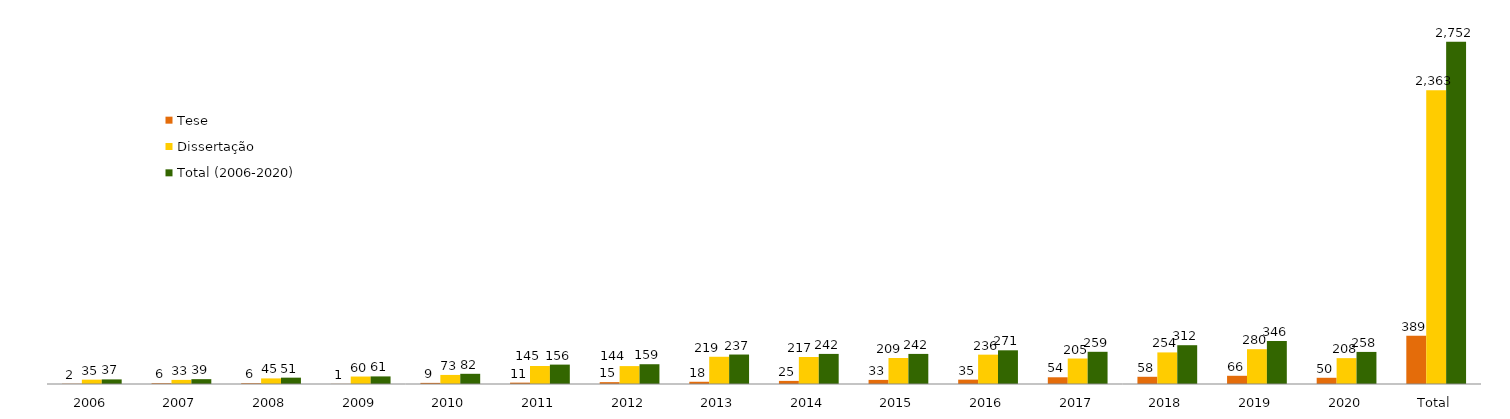
| Category | Tese | Dissertação | Total (2006-2020) |
|---|---|---|---|
| 2006 | 2 | 35 | 37 |
| 2007 | 6 | 33 | 39 |
| 2008 | 6 | 45 | 51 |
| 2009 | 1 | 60 | 61 |
| 2010 | 9 | 73 | 82 |
| 2011 | 11 | 145 | 156 |
| 2012 | 15 | 144 | 159 |
| 2013 | 18 | 219 | 237 |
| 2014 | 25 | 217 | 242 |
| 2015 | 33 | 209 | 242 |
| 2016 | 35 | 236 | 271 |
| 2017 | 54 | 205 | 259 |
| 2018 | 58 | 254 | 312 |
| 2019 | 66 | 280 | 346 |
| 2020 | 50 | 208 | 258 |
| Total | 389 | 2363 | 2752 |